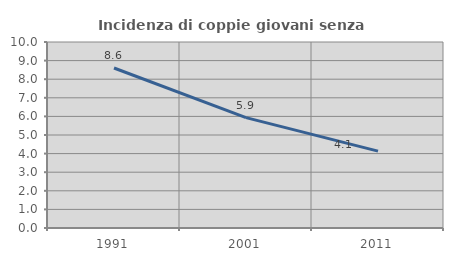
| Category | Incidenza di coppie giovani senza figli |
|---|---|
| 1991.0 | 8.602 |
| 2001.0 | 5.936 |
| 2011.0 | 4.135 |